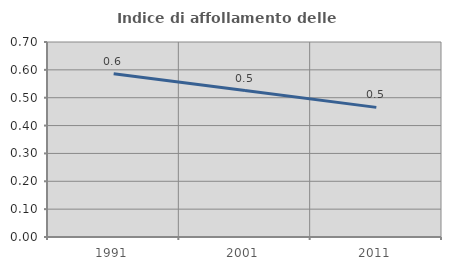
| Category | Indice di affollamento delle abitazioni  |
|---|---|
| 1991.0 | 0.586 |
| 2001.0 | 0.526 |
| 2011.0 | 0.465 |